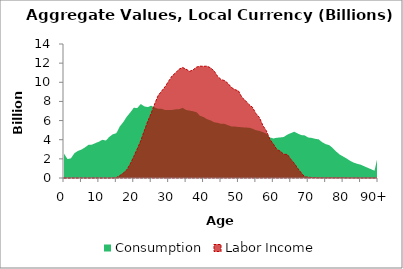
| Category | Consumption | Labor Income |
|---|---|---|
| 0 | 2552.915 | 0 |
|  | 1976.537 | 0 |
| 2 | 2057.189 | 0 |
| 3 | 2597.911 | 0 |
| 4 | 2829.683 | 0 |
| 5 | 2970.518 | 0 |
| 6 | 3191.73 | 0 |
| 7 | 3462.342 | 0 |
| 8 | 3487.858 | 0 |
| 9 | 3644.327 | 0 |
| 10 | 3795.672 | 0 |
| 11 | 3989.814 | 0 |
| 12 | 3919.033 | 0 |
| 13 | 4298.462 | 0 |
| 14 | 4568.371 | 5.482 |
| 15 | 4684.292 | 43.352 |
| 16 | 5387.79 | 247.11 |
| 17 | 5841.676 | 516.453 |
| 18 | 6409.737 | 856.11 |
| 19 | 6849.784 | 1473.956 |
| 20 | 7339.606 | 2243.034 |
| 21 | 7307.073 | 3038.748 |
| 22 | 7731.014 | 3885.903 |
| 23 | 7486.945 | 4915.442 |
| 24 | 7406.38 | 5912.253 |
| 25 | 7556.142 | 6772.488 |
| 26 | 7369.777 | 7751.681 |
| 27 | 7230.26 | 8623.078 |
| 28 | 7225.765 | 9085.998 |
| 29 | 7100.28 | 9549.969 |
| 30 | 7092.248 | 10125.6 |
| 31 | 7114.378 | 10672.301 |
| 32 | 7171.799 | 10990.715 |
| 33 | 7188.534 | 11376.919 |
| 34 | 7327.761 | 11543.725 |
| 35 | 7106.698 | 11367.307 |
| 36 | 7043.003 | 11144.082 |
| 37 | 6972.571 | 11294.278 |
| 38 | 6864.485 | 11588.569 |
| 39 | 6494.87 | 11682.738 |
| 40 | 6370.413 | 11670.085 |
| 41 | 6146.355 | 11683.26 |
| 42 | 6021.498 | 11507.976 |
| 43 | 5827.015 | 11192.799 |
| 44 | 5768.648 | 10635.386 |
| 45 | 5667.015 | 10293.017 |
| 46 | 5659.536 | 10175.612 |
| 47 | 5518.842 | 9888.331 |
| 48 | 5387.673 | 9453.283 |
| 49 | 5379.006 | 9235.377 |
| 50 | 5326.362 | 9100.5 |
| 51 | 5306.381 | 8418.041 |
| 52 | 5267.685 | 8089.721 |
| 53 | 5258.173 | 7677.634 |
| 54 | 5157.258 | 7398.409 |
| 55 | 4990.853 | 6743.283 |
| 56 | 4920.145 | 6327.546 |
| 57 | 4796.328 | 5487.2 |
| 58 | 4632.132 | 4932.556 |
| 59 | 4239.647 | 4048.31 |
| 60 | 4132.052 | 3548.053 |
| 61 | 4202.506 | 2976.205 |
| 62 | 4239.191 | 2799.537 |
| 63 | 4282.483 | 2470.285 |
| 64 | 4525.932 | 2465.6 |
| 65 | 4687.049 | 1961.347 |
| 66 | 4836.29 | 1537.036 |
| 67 | 4645.37 | 1006.161 |
| 68 | 4484.793 | 532.785 |
| 69 | 4450.836 | 119.722 |
| 70 | 4228.828 | 81.227 |
| 71 | 4188.838 | 48.893 |
| 72 | 4093.971 | 41.763 |
| 73 | 4035.045 | 18.508 |
| 74 | 3742.181 | 15.736 |
| 75 | 3541.193 | 10.673 |
| 76 | 3437.544 | 16.736 |
| 77 | 3144.661 | 14.969 |
| 78 | 2773.583 | 15.81 |
| 79 | 2456.806 | 15.443 |
| 80 | 2247.227 | 16.896 |
| 81 | 2040.612 | 7.506 |
| 82 | 1800.711 | 6.474 |
| 83 | 1609.248 | 4.628 |
| 84 | 1486.859 | 4.173 |
| 85 | 1395.277 | 1.545 |
| 86 | 1233.467 | 1.269 |
| 87 | 1073.358 | 1.152 |
| 88 | 923.929 | 0.251 |
| 89 | 756.429 | 0 |
| 90+ | 2378.536 | 0 |